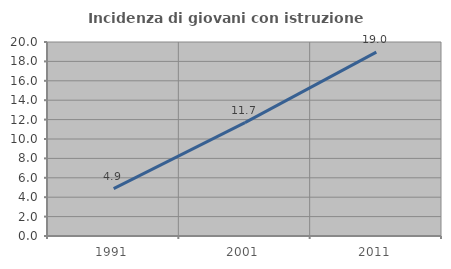
| Category | Incidenza di giovani con istruzione universitaria |
|---|---|
| 1991.0 | 4.878 |
| 2001.0 | 11.688 |
| 2011.0 | 18.953 |